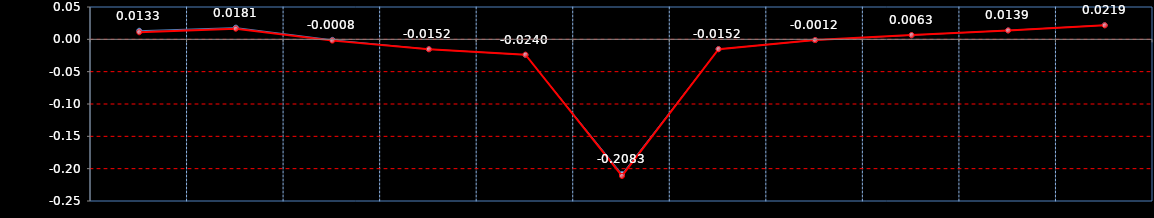
| Category | Last | Settlement |
|---|---|---|
| OCT, NOV | 0.013 | 0.011 |
| NOV, DEC | 0.018 | 0.016 |
| DEC, JAN | -0.001 | -0.002 |
| JAN, FEB | -0.015 | -0.015 |
| FEB, MAR | -0.024 | -0.024 |
| MAR, APR | -0.208 | -0.211 |
| APR, MAY | -0.015 | -0.015 |
| MAY, JUN | -0.001 | -0.001 |
| JUN, JUL | 0.006 | 0.007 |
| JUL, AUG | 0.014 | 0.014 |
| AUG, SEP | 0.022 | 0.022 |